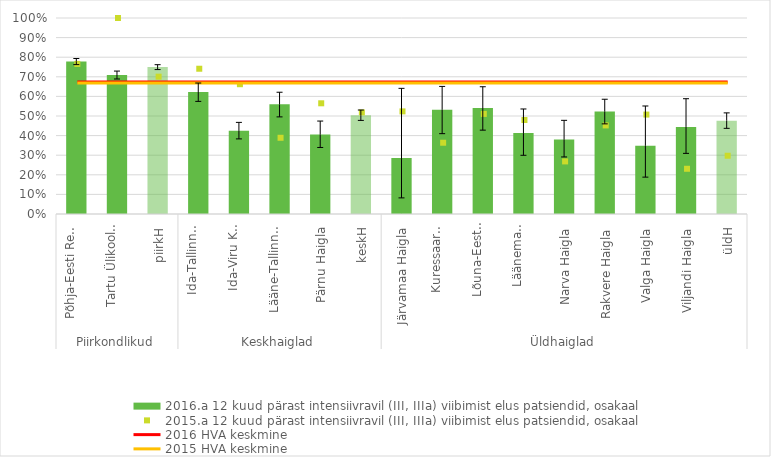
| Category | 2016.a 12 kuud pärast intensiivravil (III, IIIa) viibimist elus patsiendid, osakaal |
|---|---|
| 0 | 0.778 |
| 1 | 0.709 |
| 2 | 0.75 |
| 3 | 0.623 |
| 4 | 0.425 |
| 5 | 0.559 |
| 6 | 0.405 |
| 7 | 0.504 |
| 8 | 0.286 |
| 9 | 0.532 |
| 10 | 0.541 |
| 11 | 0.413 |
| 12 | 0.38 |
| 13 | 0.523 |
| 14 | 0.348 |
| 15 | 0.444 |
| 16 | 0.476 |